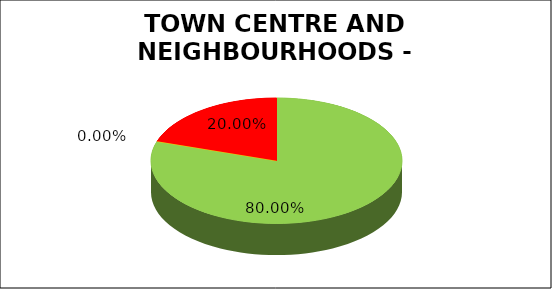
| Category | Series 0 |
|---|---|
| Green | 0.8 |
| Amber | 0 |
| Red | 0.2 |